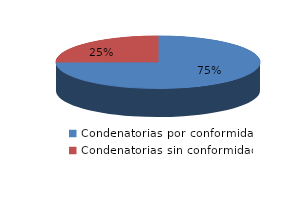
| Category | Series 0 |
|---|---|
| 0 | 83 |
| 1 | 28 |